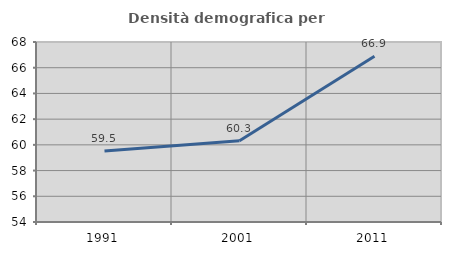
| Category | Densità demografica |
|---|---|
| 1991.0 | 59.518 |
| 2001.0 | 60.325 |
| 2011.0 | 66.9 |